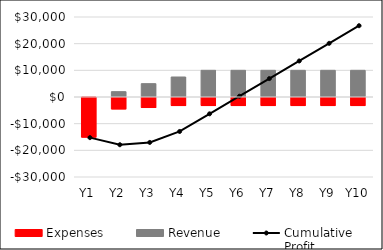
| Category | Expenses | Revenue |
|---|---|---|
| Y1 | -15240 | 0 |
| Y2 | -4660 | 2000 |
| Y3 | -4135 | 5000 |
| Y4 | -3390 | 7500 |
| Y5 | -3390 | 10000 |
| Y6 | -3390 | 10000 |
| Y7 | -3390 | 10000 |
| Y8 | -3390 | 10000 |
| Y9 | -3390 | 10000 |
| Y10 | -3390 | 10000 |